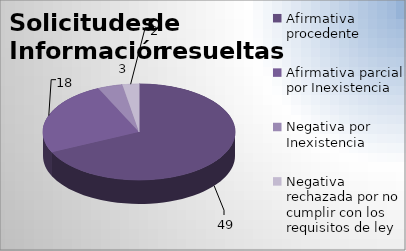
| Category | Series 0 |
|---|---|
| Afirmativa procedente  | 49 |
| Afirmativa parcial por Inexistencia  | 18 |
| Negativa por Inexistencia | 3 |
| Negativa rechazada por no cumplir con los requisitos de ley  | 2 |